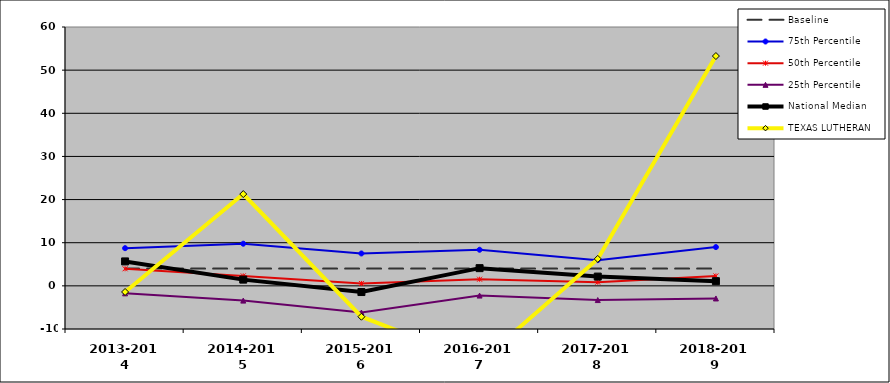
| Category | Baseline | 75th Percentile | 50th Percentile | 25th Percentile | National Median | TEXAS LUTHERAN |
|---|---|---|---|---|---|---|
| 2013-2014 | 4 | 8.737 | 3.955 | -1.738 | 5.667 | -1.419 |
| 2014-2015 | 4 | 9.769 | 2.312 | -3.42 | 1.445 | 21.272 |
| 2015-2016 | 4 | 7.507 | 0.557 | -6.177 | -1.431 | -7.157 |
| 2016-2017 | 4 | 8.37 | 1.537 | -2.251 | 4.105 | -17.719 |
| 2017-2018 | 4 | 5.965 | 0.852 | -3.295 | 2.148 | 6.249 |
| 2018-2019 | 4 | 8.987 | 2.303 | -2.92 | 1.087 | 53.269 |